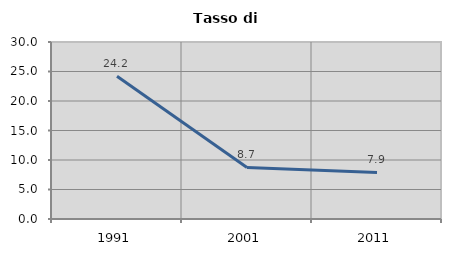
| Category | Tasso di disoccupazione   |
|---|---|
| 1991.0 | 24.205 |
| 2001.0 | 8.735 |
| 2011.0 | 7.885 |